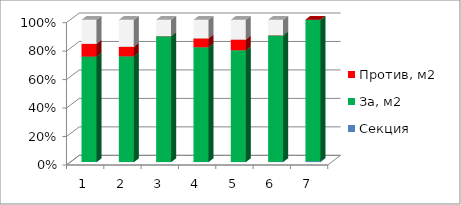
| Category | Секция | За, м2 | Против, м2 | Возд., м2 |
|---|---|---|---|---|
| 0 | 1 | 2609.827 | 313.086 | 597.1 |
| 1 | 2 | 2538.68 | 228.4 | 649.4 |
| 2 | 3 | 3295.369 | 0 | 429.3 |
| 3 | 4 | 2502.74 | 192 | 407.14 |
| 4 | 5 | 2826.23 | 270.2 | 502.57 |
| 5 | 6 | 2103.2 | 0 | 260.15 |
| 6 | 7 | 1110.4 | 0 | 0 |